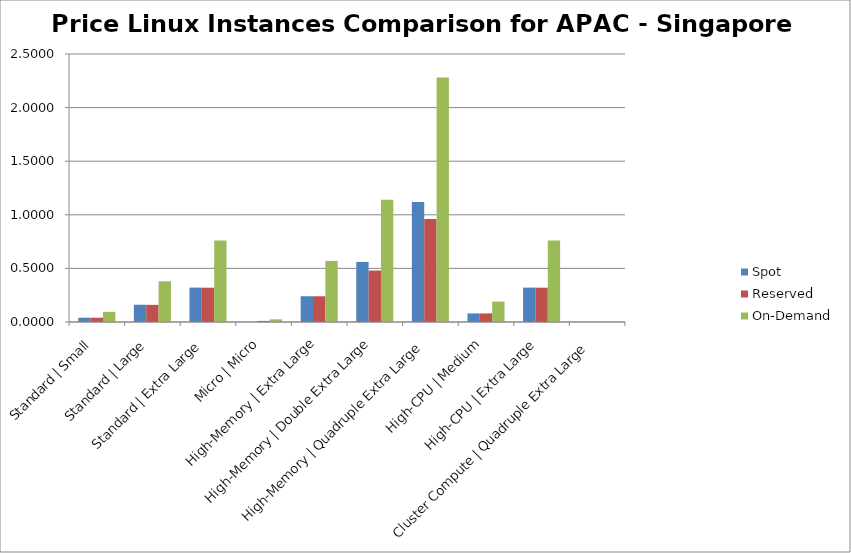
| Category | Spot | Reserved | On-Demand |
|---|---|---|---|
| Standard | Small | 0.04 | 0.04 | 0.095 |
| Standard | Large | 0.161 | 0.16 | 0.38 |
| Standard | Extra Large | 0.321 | 0.32 | 0.76 |
| Micro | Micro | 0 | 0.01 | 0.025 |
| High-Memory | Extra Large | 0.24 | 0.24 | 0.57 |
| High-Memory | Double Extra Large | 0.561 | 0.48 | 1.14 |
| High-Memory | Quadruple Extra Large | 1.119 | 0.96 | 2.28 |
| High-CPU | Medium | 0.08 | 0.08 | 0.19 |
| High-CPU | Extra Large | 0.321 | 0.32 | 0.76 |
| Cluster Compute | Quadruple Extra Large | 0 | 0 | 0 |